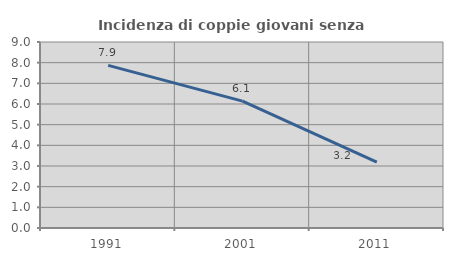
| Category | Incidenza di coppie giovani senza figli |
|---|---|
| 1991.0 | 7.869 |
| 2001.0 | 6.138 |
| 2011.0 | 3.188 |